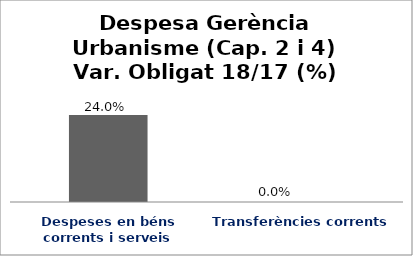
| Category | Series 0 |
|---|---|
| Despeses en béns corrents i serveis | 0.24 |
| Transferències corrents | 0 |